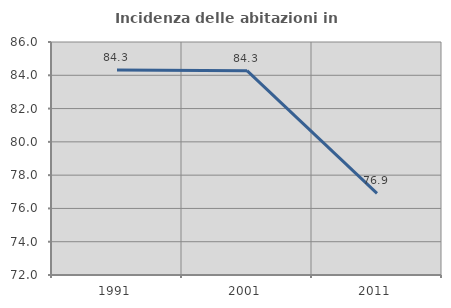
| Category | Incidenza delle abitazioni in proprietà  |
|---|---|
| 1991.0 | 84.322 |
| 2001.0 | 84.277 |
| 2011.0 | 76.901 |